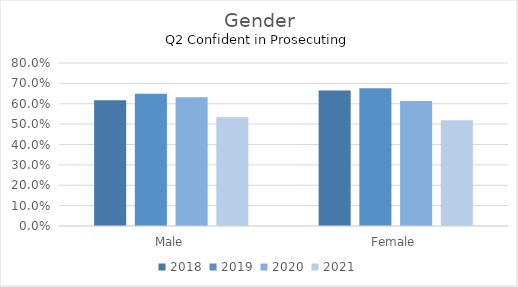
| Category | 2018 | 2019 | 2020 | 2021 |
|---|---|---|---|---|
| Male | 0.617 | 0.649 | 0.632 | 0.533 |
| Female | 0.665 | 0.676 | 0.613 | 0.519 |